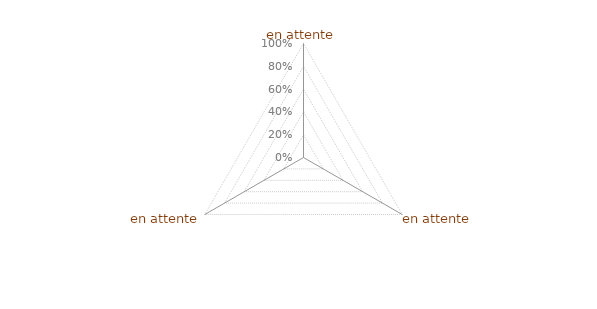
| Category | Article 10 |
|---|---|
| 0 | 0 |
| 1 | 0 |
| 2 | 0 |